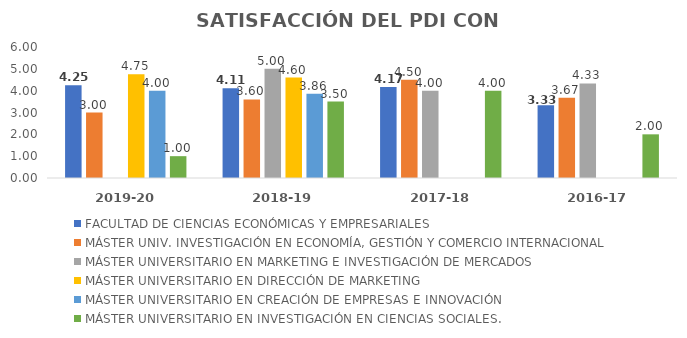
| Category | FACULTAD DE CIENCIAS ECONÓMICAS Y EMPRESARIALES | MÁSTER UNIV. INVESTIGACIÓN EN ECONOMÍA, GESTIÓN Y COMERCIO INTERNACIONAL | MÁSTER UNIVERSITARIO EN MARKETING E INVESTIGACIÓN DE MERCADOS | MÁSTER UNIVERSITARIO EN DIRECCIÓN DE MARKETING | MÁSTER UNIVERSITARIO EN CREACIÓN DE EMPRESAS E INNOVACIÓN | MÁSTER UNIVERSITARIO EN INVESTIGACIÓN EN CIENCIAS SOCIALES. |
|---|---|---|---|---|---|---|
| 2019-20 | 4.25 | 3 | 0 | 4.75 | 4 | 1 |
| 2018-19 | 4.112 | 3.6 | 5 | 4.6 | 3.86 | 3.5 |
| 2017-18 | 4.167 | 4.5 | 4 | 0 | 0 | 4 |
| 2016-17 | 3.333 | 3.67 | 4.33 | 0 | 0 | 2 |